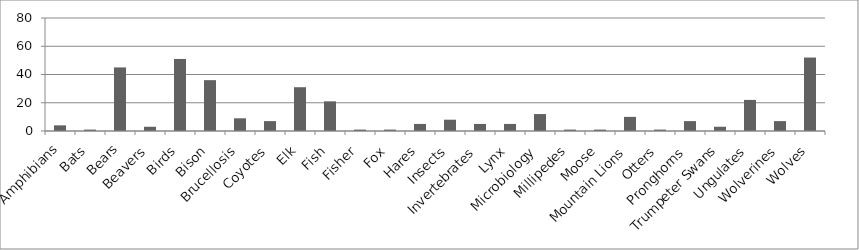
| Category | Series 0 |
|---|---|
| Amphibians | 4 |
| Bats | 1 |
| Bears | 45 |
| Beavers | 3 |
| Birds | 51 |
| Bison | 36 |
| Brucellosis | 9 |
| Coyotes | 7 |
| Elk | 31 |
| Fish | 21 |
| Fisher | 1 |
| Fox | 1 |
| Hares | 5 |
| Insects | 8 |
| Invertebrates | 5 |
| Lynx | 5 |
| Microbiology | 12 |
| Millipedes | 1 |
| Moose | 1 |
| Mountain Lions | 10 |
| Otters | 1 |
| Pronghorns | 7 |
| Trumpeter Swans | 3 |
| Ungulates | 22 |
| Wolverines | 7 |
| Wolves | 52 |